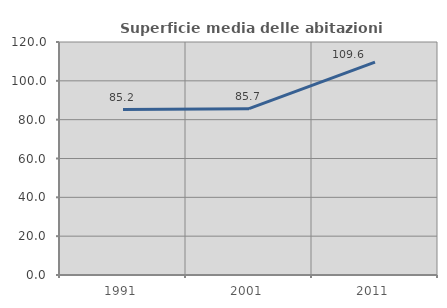
| Category | Superficie media delle abitazioni occupate |
|---|---|
| 1991.0 | 85.235 |
| 2001.0 | 85.681 |
| 2011.0 | 109.62 |